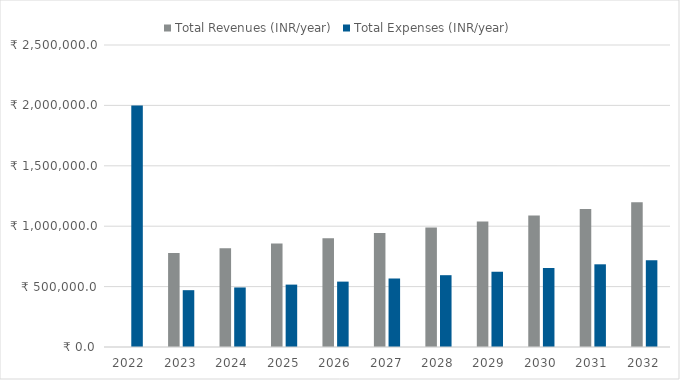
| Category | Total Revenues (INR/year) | Total Expenses (INR/year) |
|---|---|---|
| 2022.0 | 0 | 2000000 |
| 2023.0 | 778956.75 | 470358.42 |
| 2024.0 | 817203.526 | 492858.909 |
| 2025.0 | 857328.22 | 516464.171 |
| 2026.0 | 899423.035 | 541228.452 |
| 2027.0 | 943584.706 | 567208.659 |
| 2028.0 | 989914.715 | 594464.494 |
| 2029.0 | 1038519.528 | 623058.59 |
| 2030.0 | 1089510.837 | 653056.657 |
| 2031.0 | 1143005.819 | 684527.629 |
| 2032.0 | 1199127.404 | 717543.826 |